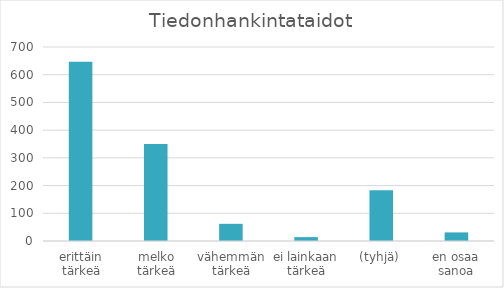
| Category | Summa |
|---|---|
| erittäin tärkeä | 647 |
| melko tärkeä | 350 |
| vähemmän tärkeä | 62 |
| ei lainkaan tärkeä | 14 |
| (tyhjä) | 183 |
| en osaa sanoa | 31 |